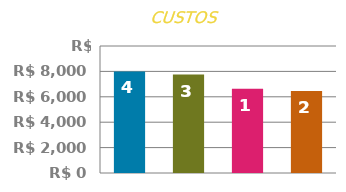
| Category | ANTECIPADO |
|---|---|
| 0 | 8000 |
| 1 | 7750 |
| 2 | 6625 |
| 3 | 6450 |